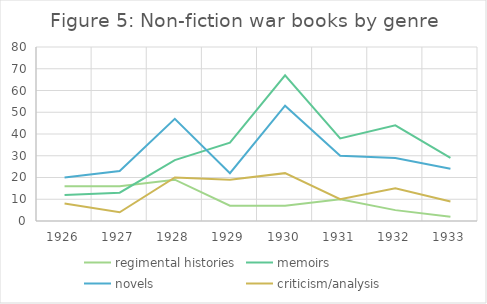
| Category | regimental histories | memoirs | novels | criticism/analysis |
|---|---|---|---|---|
| 1926.0 | 16 | 12 | 20 | 8 |
| 1927.0 | 16 | 13 | 23 | 4 |
| 1928.0 | 19 | 28 | 47 | 20 |
| 1929.0 | 7 | 36 | 22 | 19 |
| 1930.0 | 7 | 67 | 53 | 22 |
| 1931.0 | 10 | 38 | 30 | 10 |
| 1932.0 | 5 | 44 | 29 | 15 |
| 1933.0 | 2 | 29 | 24 | 9 |